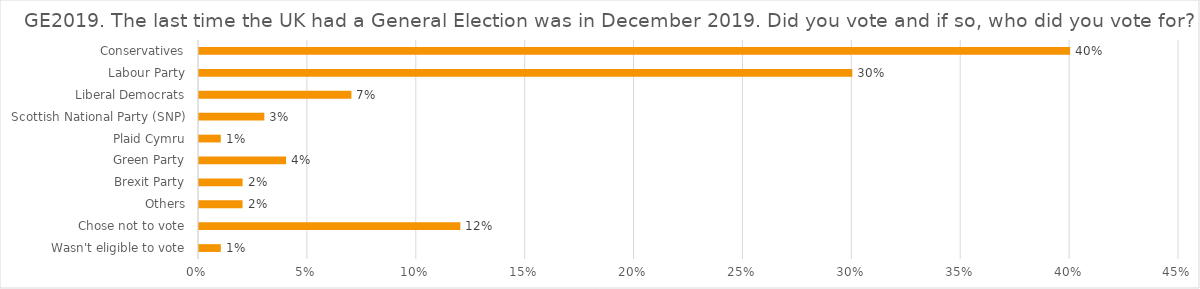
| Category | GE2019. The last time the UK had a General Election was in December 2019. Did you vote and if so, who did you vote for? |
|---|---|
| Wasn't eligible to vote | 0.01 |
| Chose not to vote | 0.12 |
| Others | 0.02 |
| Brexit Party | 0.02 |
| Green Party | 0.04 |
| Plaid Cymru | 0.01 |
| Scottish National Party (SNP) | 0.03 |
| Liberal Democrats | 0.07 |
| Labour Party | 0.3 |
| Conservatives | 0.4 |